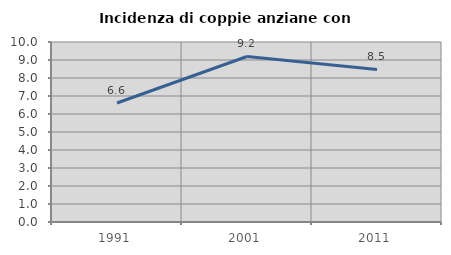
| Category | Incidenza di coppie anziane con figli |
|---|---|
| 1991.0 | 6.612 |
| 2001.0 | 9.195 |
| 2011.0 | 8.475 |